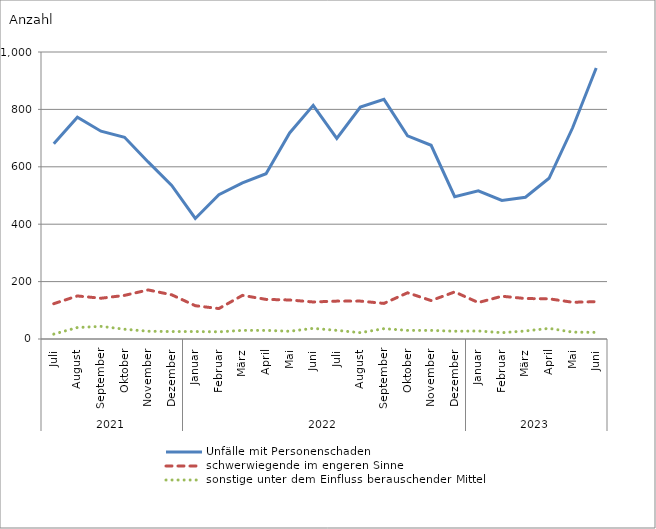
| Category | Unfälle mit Personenschaden | schwerwiegende im engeren Sinne | sonstige unter dem Einfluss berauschender Mittel |
|---|---|---|---|
| 0 | 680 | 123 | 17 |
| 1 | 773 | 150 | 40 |
| 2 | 724 | 142 | 44 |
| 3 | 703 | 152 | 34 |
| 4 | 617 | 171 | 27 |
| 5 | 535 | 154 | 26 |
| 6 | 420 | 116 | 26 |
| 7 | 503 | 106 | 25 |
| 8 | 544 | 152 | 30 |
| 9 | 576 | 138 | 30 |
| 10 | 718 | 136 | 27 |
| 11 | 814 | 129 | 37 |
| 12 | 699 | 132 | 30 |
| 13 | 808 | 132 | 22 |
| 14 | 835 | 124 | 36 |
| 15 | 708 | 161 | 30 |
| 16 | 675 | 134 | 30 |
| 17 | 496 | 164 | 27 |
| 18 | 516 | 127 | 28 |
| 19 | 483 | 149 | 22 |
| 20 | 494 | 141 | 28 |
| 21 | 560 | 140 | 37 |
| 22 | 736 | 128 | 24 |
| 23 | 944 | 130 | 23 |